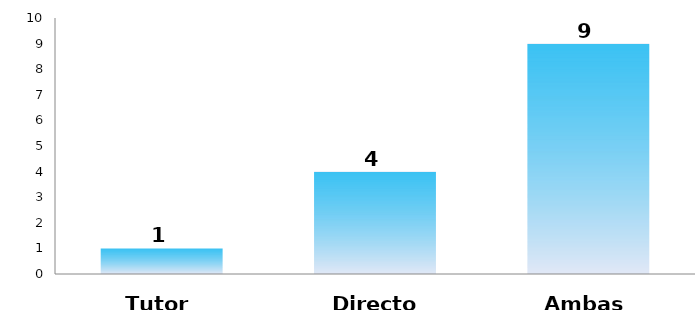
| Category | Series 0 |
|---|---|
| Tutor | 1 |
| Director | 4 |
| Ambas | 9 |